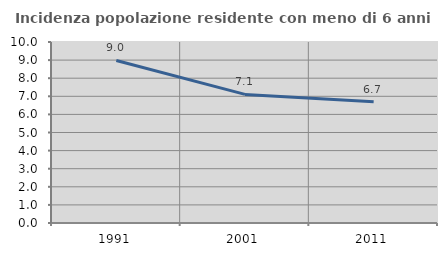
| Category | Incidenza popolazione residente con meno di 6 anni |
|---|---|
| 1991.0 | 8.979 |
| 2001.0 | 7.105 |
| 2011.0 | 6.704 |